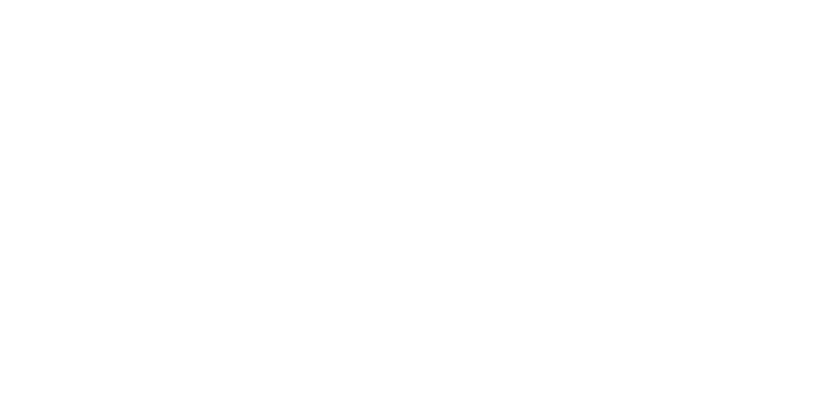
| Category | Positivo  | Negativo  |
|---|---|---|
| Transparencia | 80.189 | 19.811 |
| Respeto a los Derechos Humanos | 87.729 | 12.271 |
| Respeto | 92.643 | 7.357 |
| Rendición de cuentas | 92.369 | 7.631 |
| Liderazgo | 87.851 | 12.149 |
| Interés Público | 87.759 | 12.241 |
| Integridad | 86.752 | 13.248 |
| Igualdad y no discriminación | 93.162 | 6.838 |
| Equidad de género | 92.399 | 7.601 |
| Entorno cultural y ecológico | 64.042 | 35.958 |
| Cooperación | 89.377 | 10.623 |